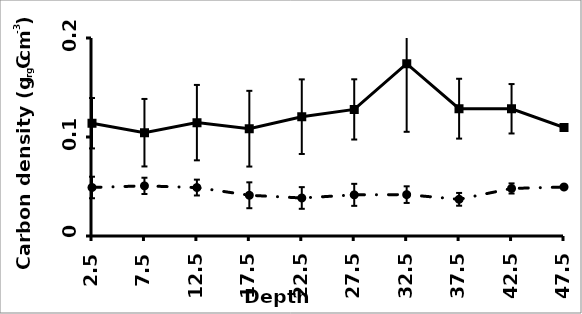
| Category | Vegetated | Un-vegetated |
|---|---|---|
| 2.5 | 0.114 | 0.049 |
| 7.5 | 0.104 | 0.051 |
| 12.5 | 0.115 | 0.049 |
| 17.5 | 0.108 | 0.041 |
| 22.5 | 0.121 | 0.038 |
| 27.5 | 0.128 | 0.042 |
| 32.5 | 0.174 | 0.042 |
| 37.5 | 0.129 | 0.037 |
| 42.5 | 0.129 | 0.048 |
| 47.5 | 0.11 | 0.049 |